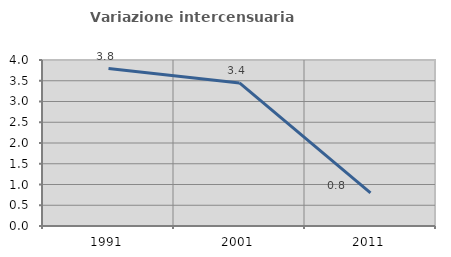
| Category | Variazione intercensuaria annua |
|---|---|
| 1991.0 | 3.792 |
| 2001.0 | 3.448 |
| 2011.0 | 0.797 |